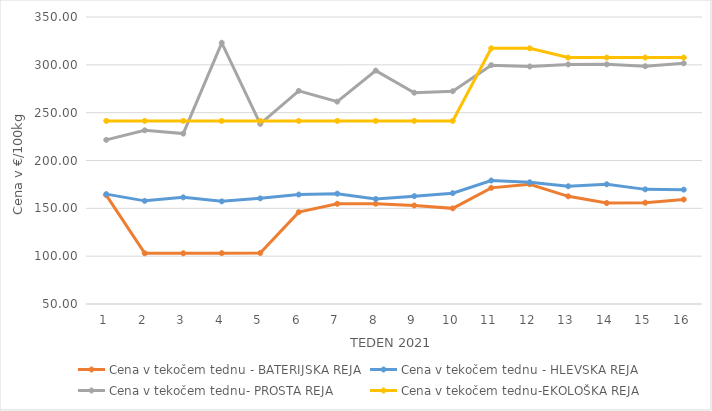
| Category | Cena v tekočem tednu - BATERIJSKA REJA | Cena v tekočem tednu - HLEVSKA REJA | Cena v tekočem tednu- PROSTA REJA | Cena v tekočem tednu-EKOLOŠKA REJA |
|---|---|---|---|---|
| 1.0 | 163.81 | 164.86 | 221.55 | 241.38 |
| 2.0 | 103.02 | 157.81 | 231.55 | 241.38 |
| 3.0 | 103.03 | 161.48 | 228.1 | 241.38 |
| 4.0 | 103.15 | 157.29 | 322.93 | 241.38 |
| 5.0 | 103.34 | 160.43 | 238.28 | 241.38 |
| 6.0 | 146.03 | 164.39 | 272.76 | 241.38 |
| 7.0 | 154.77 | 165.34 | 261.55 | 241.38 |
| 8.0 | 154.86 | 159.79 | 293.97 | 241.38 |
| 9.0 | 153 | 162.73 | 270.86 | 241.38 |
| 10.0 | 149.98 | 165.85 | 272.41 | 241.38 |
| 11.0 | 171.4 | 179.09 | 299.66 | 317.24 |
| 12.0 | 175.2 | 177.21 | 298.27 | 317.24 |
| 13.0 | 162.57 | 173.07 | 300.45 | 307.59 |
| 14.0 | 155.55 | 175.17 | 300.49 | 307.59 |
| 15.0 | 155.88 | 169.83 | 298.52 | 307.59 |
| 16.0 | 159.26 | 169.55 | 301.6 | 307.59 |